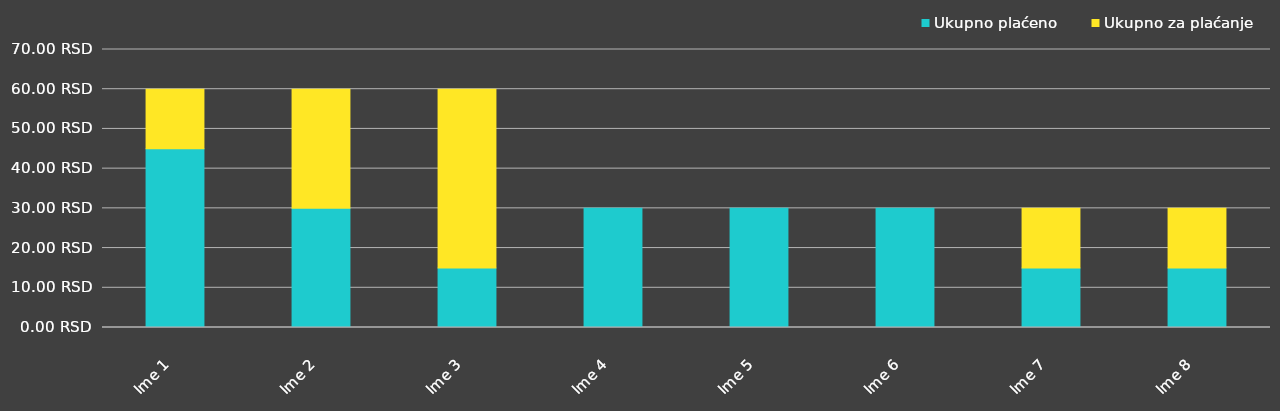
| Category | Ukupno plaćeno | Ukupno za plaćanje |
|---|---|---|
| Ime 1 | 45 | 15 |
| Ime 2 | 30 | 30 |
| Ime 3 | 15 | 45 |
| Ime 4 | 30 | 0 |
| Ime 5 | 30 | 0 |
| Ime 6 | 30 | 0 |
| Ime 7 | 15 | 15 |
| Ime 8 | 15 | 15 |